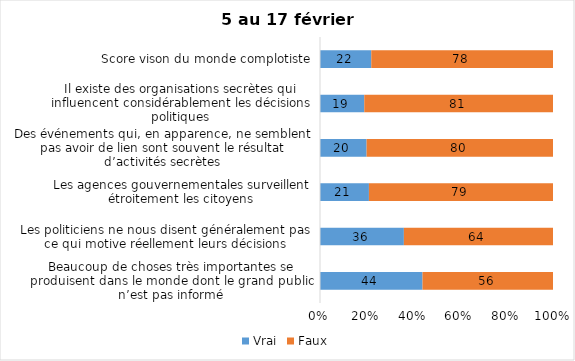
| Category | Vrai | Faux |
|---|---|---|
| Beaucoup de choses très importantes se produisent dans le monde dont le grand public n’est pas informé | 44 | 56 |
| Les politiciens ne nous disent généralement pas ce qui motive réellement leurs décisions | 36 | 64 |
| Les agences gouvernementales surveillent étroitement les citoyens | 21 | 79 |
| Des événements qui, en apparence, ne semblent pas avoir de lien sont souvent le résultat d’activités secrètes | 20 | 80 |
| Il existe des organisations secrètes qui influencent considérablement les décisions politiques | 19 | 81 |
| Score vison du monde complotiste | 22 | 78 |